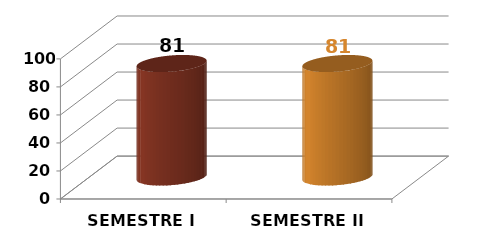
| Category | Series 0 |
|---|---|
| SEMESTRE I | 81 |
| SEMESTRE II | 81 |